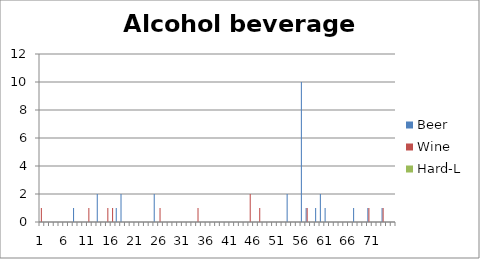
| Category | Beer | Wine | Hard-L |
|---|---|---|---|
| 0 | 0 | 1 | 0 |
| 1 | 0 | 0 | 0 |
| 2 | 0 | 0 | 0 |
| 3 | 0 | 0 | 0 |
| 4 | 0 | 0 | 0 |
| 5 | 0 | 0 | 0 |
| 6 | 0 | 0 | 0 |
| 7 | 1 | 0 | 0 |
| 8 | 0 | 0 | 0 |
| 9 | 0 | 0 | 0 |
| 10 | 0 | 1 | 0 |
| 11 | 0 | 0 | 0 |
| 12 | 2 | 0 | 0 |
| 13 | 0 | 0 | 0 |
| 14 | 0 | 1 | 0 |
| 15 | 0 | 1 | 0 |
| 16 | 1 | 0 | 0 |
| 17 | 2 | 0 | 0 |
| 18 | 0 | 0 | 0 |
| 19 | 0 | 0 | 0 |
| 20 | 0 | 0 | 0 |
| 21 | 0 | 0 | 0 |
| 22 | 0 | 0 | 0 |
| 23 | 0 | 0 | 0 |
| 24 | 2 | 0 | 0 |
| 25 | 0 | 1 | 0 |
| 26 | 0 | 0 | 0 |
| 27 | 0 | 0 | 0 |
| 28 | 0 | 0 | 0 |
| 29 | 0 | 0 | 0 |
| 30 | 0 | 0 | 0 |
| 31 | 0 | 0 | 0 |
| 32 | 0 | 0 | 0 |
| 33 | 0 | 1 | 0 |
| 34 | 0 | 0 | 0 |
| 35 | 0 | 0 | 0 |
| 36 | 0 | 0 | 0 |
| 37 | 0 | 0 | 0 |
| 38 | 0 | 0 | 0 |
| 39 | 0 | 0 | 0 |
| 40 | 0 | 0 | 0 |
| 41 | 0 | 0 | 0 |
| 42 | 0 | 0 | 0 |
| 43 | 0 | 0 | 0 |
| 44 | 0 | 2 | 0 |
| 45 | 0 | 0 | 0 |
| 46 | 0 | 1 | 0 |
| 47 | 0 | 0 | 0 |
| 48 | 0 | 0 | 0 |
| 49 | 0 | 0 | 0 |
| 50 | 0 | 0 | 0 |
| 51 | 0 | 0 | 0 |
| 52 | 2 | 0 | 0 |
| 53 | 0 | 0 | 0 |
| 54 | 0 | 0 | 0 |
| 55 | 10 | 0 | 0 |
| 56 | 1 | 1 | 0 |
| 57 | 0 | 0 | 0 |
| 58 | 1 | 0 | 0 |
| 59 | 2 | 0 | 0 |
| 60 | 1 | 0 | 0 |
| 61 | 0 | 0 | 0 |
| 62 | 0 | 0 | 0 |
| 63 | 0 | 0 | 0 |
| 64 | 0 | 0 | 0 |
| 65 | 0 | 0 | 0 |
| 66 | 1 | 0 | 0 |
| 67 | 0 | 0 | 0 |
| 68 | 0 | 0 | 0 |
| 69 | 1 | 1 | 0 |
| 70 | 0 | 0 | 0 |
| 71 | 0 | 0 | 0 |
| 72 | 1 | 1 | 0 |
| 73 | 0 | 0 | 0 |
| 74 | 0 | 0 | 0 |